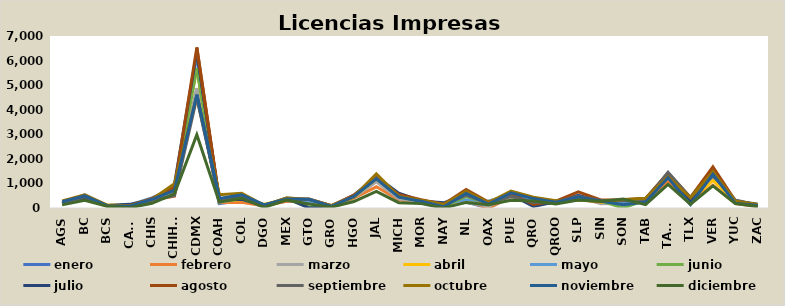
| Category | enero | febrero | marzo | abril | mayo | junio | julio | agosto | septiembre | octubre | noviembre | diciembre |
|---|---|---|---|---|---|---|---|---|---|---|---|---|
| AGS | 190 | 192 | 176 | 207 | 190 | 170 | 172 | 210 | 182 | 289 | 254 | 128 |
| BC | 388 | 471 | 540 | 498 | 515 | 371 | 430 | 490 | 461 | 540 | 498 | 310 |
| BCS | 99 | 65 | 96 | 116 | 78 | 91 | 100 | 96 | 94 | 120 | 96 | 73 |
| CAMP | 18 | 100 | 97 | 111 | 124 | 118 | 148 | 97 | 0 | 93 | 74 | 9 |
| CHIS | 290 | 310 | 346 | 357 | 410 | 341 | 336 | 391 | 317 | 349 | 355 | 191 |
| CHIHU | 716 | 476 | 575 | 792 | 824 | 733 | 946 | 837 | 503 | 985 | 716 | 577 |
| CDMX | 4849 | 4727 | 4886 | 5682 | 6166 | 5692 | 6344 | 6534 | 4486 | 4567 | 4612 | 2981 |
| COAH | 177 | 212 | 221 | 281 | 274 | 310 | 313 | 348 | 357 | 544 | 389 | 240 |
| COL | 305 | 234 | 383 | 344 | 412 | 359 | 351 | 467 | 479 | 596 | 539 | 399 |
| DGO | 120 | 82 | 55 | 152 | 133 | 103 | 98 | 117 | 101 | 106 | 124 | 26 |
| MEX | 288 | 272 | 329 | 357 | 342 | 372 | 397 | 318 | 402 | 402 | 364 | 325 |
| GTO | 218 | 291 | 253 | 339 | 240 | 28 | 1 | 362 | 346 | 352 | 356 | 166 |
| GRO | 88 | 62 | 95 | 80 | 71 | 58 | 43 | 97 | 95 | 93 | 66 | 36 |
| HGO | 406 | 402 | 429 | 449 | 472 | 454 | 527 | 523 | 450 | 462 | 475 | 264 |
| JAL | 1115 | 862 | 1069 | 1188 | 1217 | 1208 | 1280 | 1199 | 1269 | 1392 | 1187 | 677 |
| MICH | 441 | 329 | 372 | 513 | 523 | 449 | 601 | 547 | 479 | 471 | 442 | 217 |
| MOR | 272 | 206 | 258 | 282 | 279 | 267 | 288 | 336 | 261 | 316 | 274 | 178 |
| NAY | 72 | 147 | 171 | 161 | 150 | 85 | 209 | 149 | 115 | 140 | 53 | 0 |
| NL | 240 | 287 | 220 | 265 | 335 | 464 | 551 | 749 | 523 | 682 | 595 | 228 |
| OAX | 0 | 0 | 77 | 274 | 277 | 193 | 225 | 242 | 180 | 217 | 161 | 137 |
| PUE | 461 | 445 | 450 | 541 | 537 | 495 | 543 | 584 | 479 | 691 | 615 | 315 |
| QRO | 242 | 251 | 273 | 288 | 299 | 137 | 67 | 145 | 223 | 435 | 383 | 289 |
| QROO | 197 | 182 | 244 | 219 | 249 | 246 | 248 | 283 | 256 | 294 | 236 | 168 |
| SLP | 520 | 390 | 484 | 478 | 391 | 426 | 506 | 655 | 477 | 330 | 447 | 327 |
| SIN | 198 | 203 | 169 | 235 | 277 | 286 | 309 | 329 | 310 | 254 | 287 | 276 |
| SON | 214 | 236 | 192 | 282 | 211 | 2 | 313 | 340 | 296 | 348 | 137 | 365 |
| TAB | 312 | 342 | 288 | 356 | 291 | 322 | 372 | 389 | 306 | 400 | 242 | 139 |
| TAMS | 1018 | 1074 | 1304 | 1349 | 1439 | 1305 | 1409 | 1421 | 1449 | 1273 | 1232 | 958 |
| TLX | 221 | 242 | 215 | 292 | 338 | 270 | 304 | 429 | 430 | 419 | 141 | 155 |
| VER | 1210 | 929 | 1371 | 1124 | 1457 | 1610 | 1466 | 1670 | 1324 | 1476 | 1373 | 900 |
| YUC | 256 | 178 | 223 | 277 | 277 | 224 | 283 | 287 | 324 | 280 | 190 | 180 |
| ZAC | 95 | 57 | 84 | 120 | 117 | 107 | 151 | 134 | 109 | 144 | 101 | 65 |